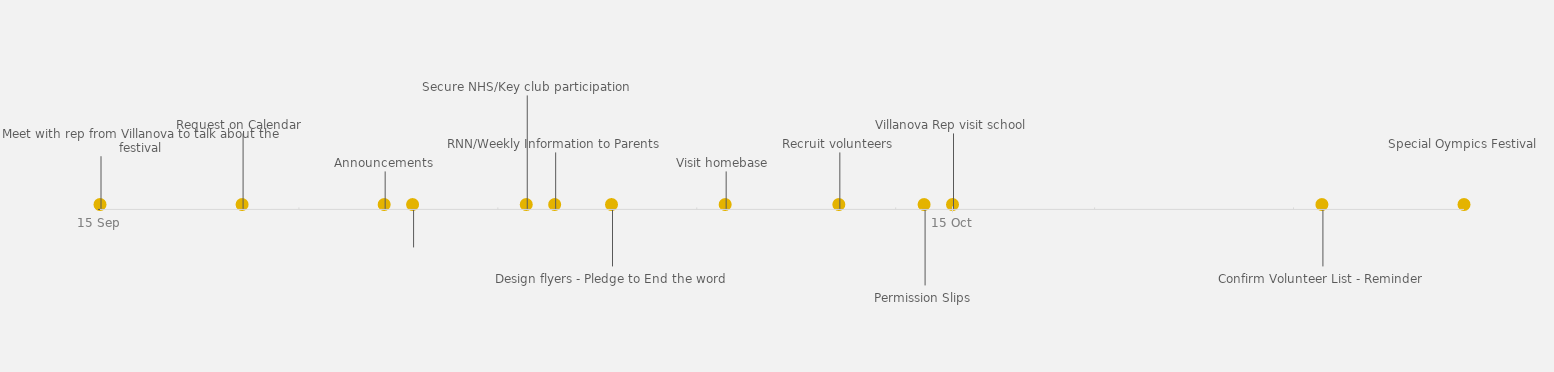
| Category | Position |
|---|---|
| Meet with rep from Villanova to talk about the festival | 14 |
| Request on Calendar  | 20 |
| Announcements | 10 |
| Transportation -Bus? Cars? | -10 |
| Secure NHS/Key club participation | 30 |
| Design flyers - Pledge to End the word | -15 |
| RNN/Weekly Information to Parents | 15 |
| Visit homebase  | 10 |
| Recruit volunteers | 15 |
| Permission Slips | -20 |
| Villanova Rep visit school | 20 |
| Confirm Volunteer List - Reminder | -15 |
| Special Oympics Festival | 15 |